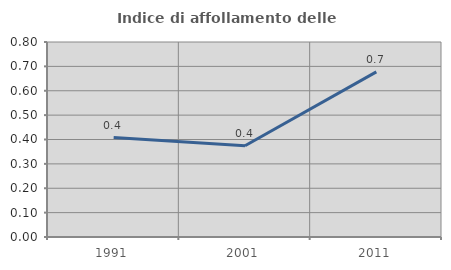
| Category | Indice di affollamento delle abitazioni  |
|---|---|
| 1991.0 | 0.408 |
| 2001.0 | 0.374 |
| 2011.0 | 0.678 |